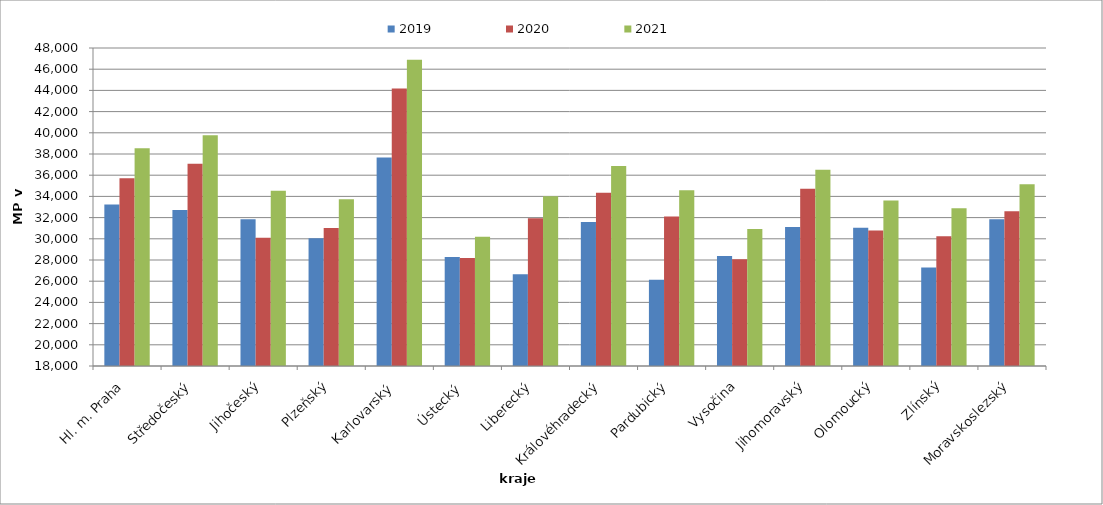
| Category | 2019 | 2020 | 2021 |
|---|---|---|---|
| Hl. m. Praha | 33246.368 | 35705.939 | 38544.026 |
| Středočeský | 32723.951 | 37079.486 | 39778.525 |
| Jihočeský | 31845.899 | 30092.877 | 34536.879 |
| Plzeňský | 30049.401 | 31014.914 | 33737.331 |
| Karlovarský  | 37673.563 | 44180 | 46899.512 |
| Ústecký   | 28273.457 | 28191.097 | 30185.648 |
| Liberecký | 26661.54 | 31940.472 | 34025.374 |
| Královéhradecký | 31573.247 | 34349.428 | 36861.595 |
| Pardubický | 26127.025 | 32104.094 | 34586.303 |
| Vysočina | 28387.878 | 28060.688 | 30935.895 |
| Jihomoravský | 31106.801 | 34727.023 | 36503.604 |
| Olomoucký | 31053.994 | 30782.685 | 33614.423 |
| Zlínský | 27299.479 | 30246.178 | 32885.258 |
| Moravskoslezský | 31855.38 | 32599.61 | 35151.53 |